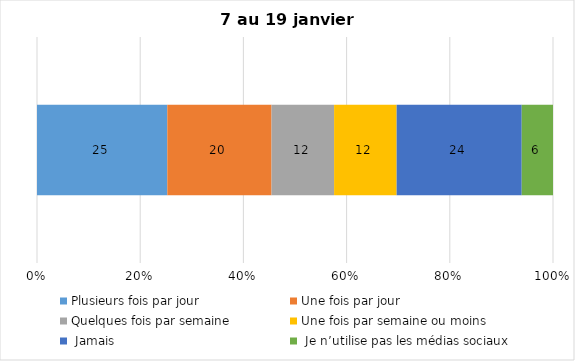
| Category | Plusieurs fois par jour | Une fois par jour | Quelques fois par semaine   | Une fois par semaine ou moins   |  Jamais   |  Je n’utilise pas les médias sociaux |
|---|---|---|---|---|---|---|
| 0 | 25 | 20 | 12 | 12 | 24 | 6 |